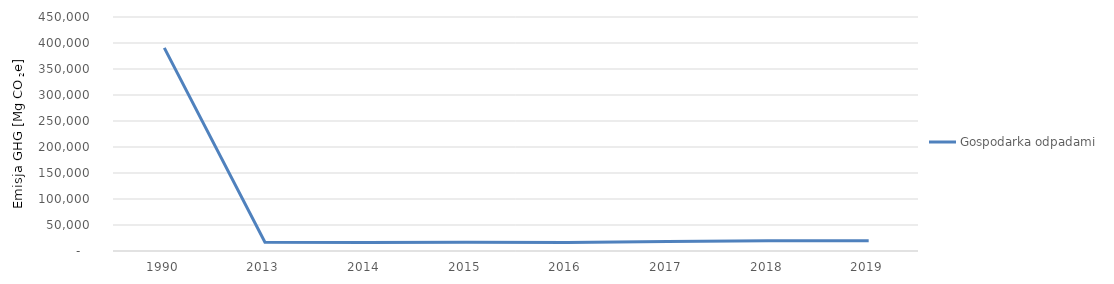
| Category | Gospodarka odpadami |
|---|---|
| 1990.0 | 390686 |
| 2013.0 | 16741 |
| 2014.0 | 16483 |
| 2015.0 | 16937 |
| 2016.0 | 16467 |
| 2017.0 | 18332 |
| 2018.0 | 19662 |
| 2019.0 | 19757 |